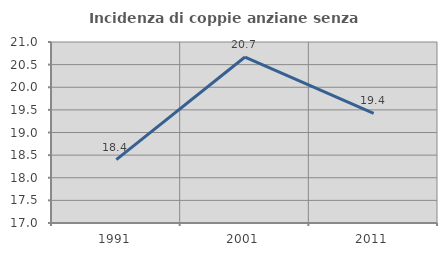
| Category | Incidenza di coppie anziane senza figli  |
|---|---|
| 1991.0 | 18.4 |
| 2001.0 | 20.668 |
| 2011.0 | 19.424 |